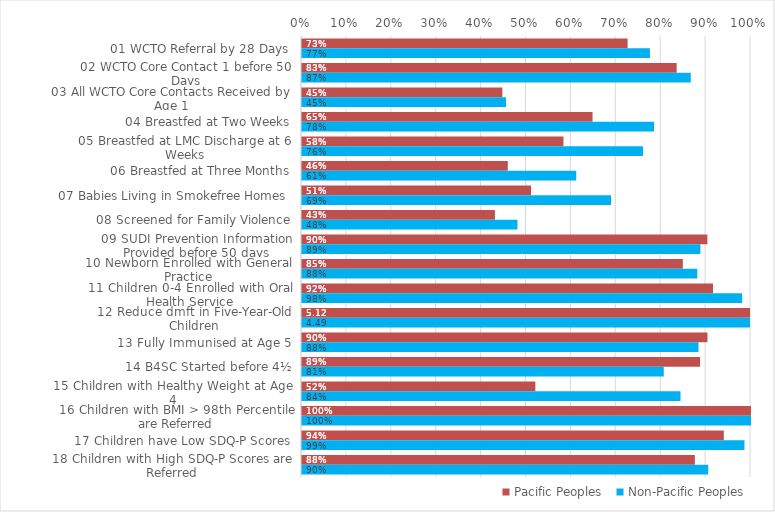
| Category | Pacific Peoples | Non-Pacific Peoples |
|---|---|---|
| 01 WCTO Referral by 28 Days | 0.725 | 0.775 |
| 02 WCTO Core Contact 1 before 50 Days | 0.834 | 0.866 |
| 03 All WCTO Core Contacts Received by Age 1 | 0.446 | 0.454 |
| 04 Breastfed at Two Weeks | 0.647 | 0.784 |
| 05 Breastfed at LMC Discharge at 6 Weeks | 0.582 | 0.76 |
| 06 Breastfed at Three Months | 0.458 | 0.611 |
| 07 Babies Living in Smokefree Homes  | 0.51 | 0.688 |
| 08 Screened for Family Violence | 0.43 | 0.48 |
| 09 SUDI Prevention Information Provided before 50 days | 0.903 | 0.887 |
| 10 Newborn Enrolled with General Practice | 0.848 | 0.88 |
| 11 Children 0-4 Enrolled with Oral Health Service | 0.915 | 0.98 |
| 12 Reduce dmft in Five-Year-Old Children | 5.118 | 4.491 |
| 13 Fully Immunised at Age 5 | 0.903 | 0.883 |
| 14 B4SC Started before 4½ | 0.887 | 0.806 |
| 15 Children with Healthy Weight at Age 4 | 0.52 | 0.843 |
| 16 Children with BMI > 98th Percentile are Referred | 1 | 1 |
| 17 Children have Low SDQ-P Scores | 0.939 | 0.985 |
| 18 Children with High SDQ-P Scores are Referred | 0.875 | 0.905 |